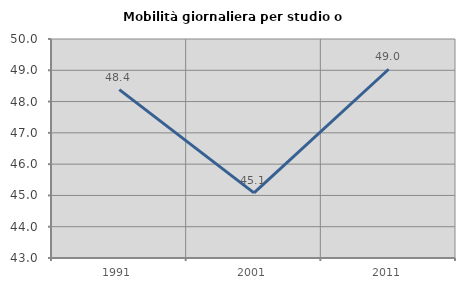
| Category | Mobilità giornaliera per studio o lavoro |
|---|---|
| 1991.0 | 48.383 |
| 2001.0 | 45.082 |
| 2011.0 | 49.032 |